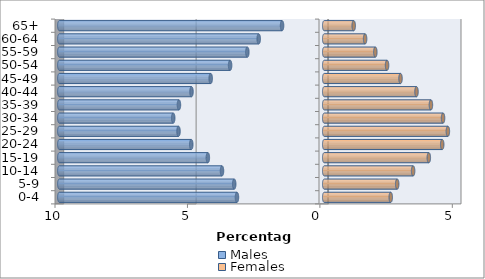
| Category | Males | Females |
|---|---|---|
| 0-4 | -3.294 | 2.511 |
| 5-9 | -3.398 | 2.755 |
| 10-14 | -3.86 | 3.356 |
| 15-19 | -4.393 | 3.949 |
| 20-24 | -5.02 | 4.454 |
| 25-29 | -5.501 | 4.668 |
| 30-34 | -5.701 | 4.487 |
| 35-39 | -5.485 | 4.028 |
| 40-44 | -5.011 | 3.484 |
| 45-49 | -4.286 | 2.88 |
| 50-54 | -3.553 | 2.372 |
| 55-59 | -2.902 | 1.93 |
| 60-64 | -2.473 | 1.543 |
| 65+ | -1.592 | 1.113 |